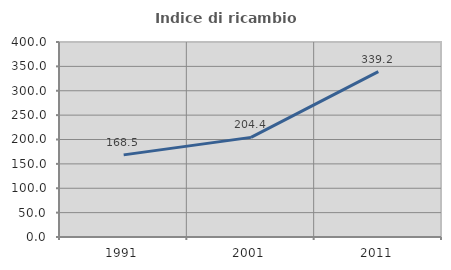
| Category | Indice di ricambio occupazionale  |
|---|---|
| 1991.0 | 168.477 |
| 2001.0 | 204.382 |
| 2011.0 | 339.203 |